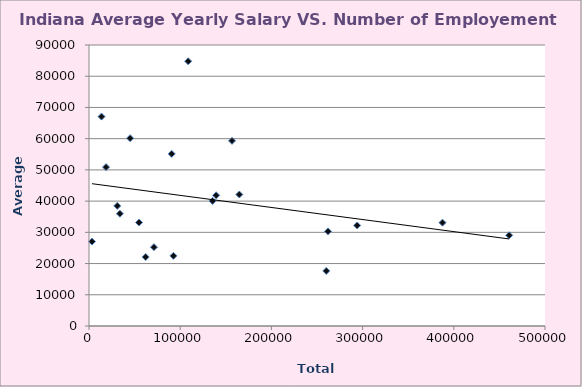
| Category | Series 0 |
|---|---|
| 108760.0 | 84800 |
| 90660.0 | 55120 |
| 45080.0 | 60150 |
| 18740.0 | 50890 |
| 33900.0 | 35970 |
| 13750.0 | 67070 |
| 164820.0 | 42110 |
| 31010.0 | 38460 |
| 156820.0 | 59310 |
| 71220.0 | 25240 |
| 54890.0 | 33140 |
| 260190.0 | 17630 |
| 92560.0 | 22470 |
| 62160.0 | 22090 |
| 294070.0 | 32200 |
| 460700.0 | 29050 |
| 3260.0 | 27040 |
| 139400.0 | 41850 |
| 135550.0 | 40050 |
| 387580.0 | 33090 |
| 262070.0 | 30310 |